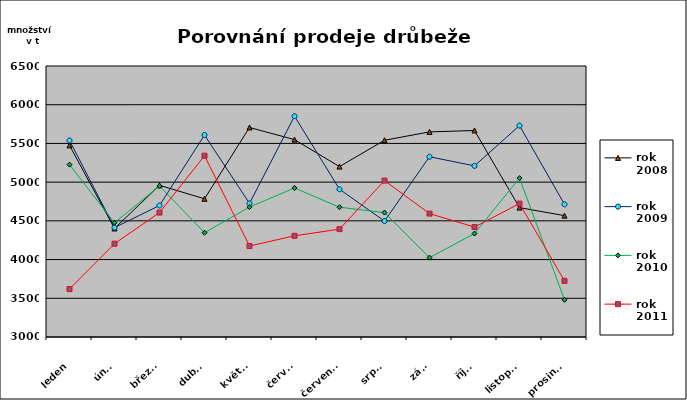
| Category | rok 2008 | rok 2009 | rok 2010 | rok 2011 |
|---|---|---|---|---|
| leden | 5475 | 5538 | 5226 | 3619 |
| únor | 4402 | 4413 | 4475 | 4205 |
| březen | 4959 | 4698 | 4951 | 4607 |
| duben | 4785 | 5609 | 4347 | 5341 |
| květen | 5706 | 4725 | 4678 | 4175 |
| červen | 5549 | 5852 | 4925 | 4307 |
| červenec | 5201 | 4908 | 4676 | 4393 |
| srpen | 5541 | 4497 | 4607 | 5020 |
| září | 5649 | 5328 | 4025 | 4594 |
| říjen | 5667 | 5210 | 4336 | 4420 |
| listopad | 4671 | 5730 | 5052 | 4723 |
| prosinec | 4567 | 4713 | 3480 | 3725 |